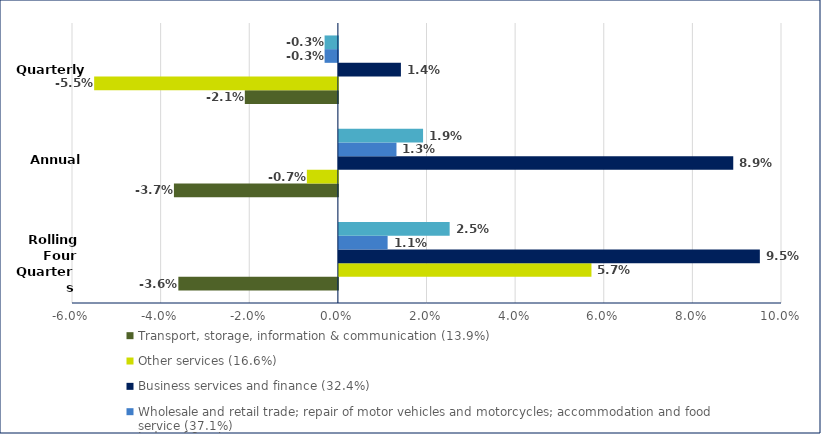
| Category | Transport, storage, information & communication (13.9%) | Other services (16.6%) | Business services and finance (32.4%) | Wholesale and retail trade; repair of motor vehicles and motorcycles; accommodation and food service (37.1%) | Index of Services |
|---|---|---|---|---|---|
|  | -0.036 | 0.057 | 0.095 | 0.011 | 0.025 |
|  | -0.037 | -0.007 | 0.089 | 0.013 | 0.019 |
|  | -0.021 | -0.055 | 0.014 | -0.003 | -0.003 |